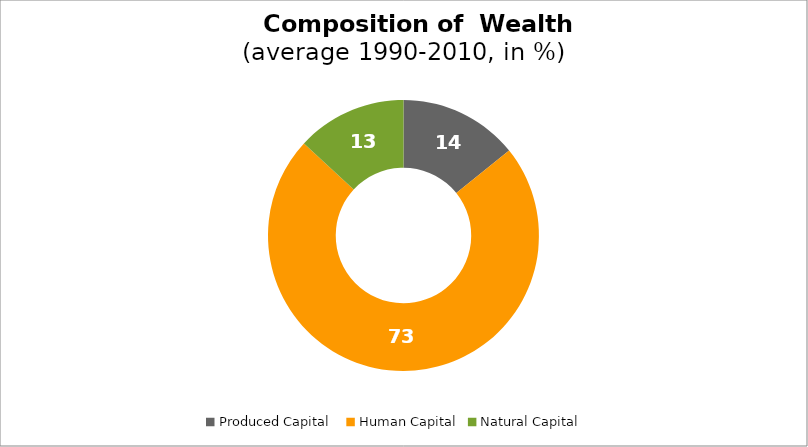
| Category | Series 0 |
|---|---|
| Produced Capital  | 14.223 |
| Human Capital | 72.64 |
| Natural Capital | 13.136 |